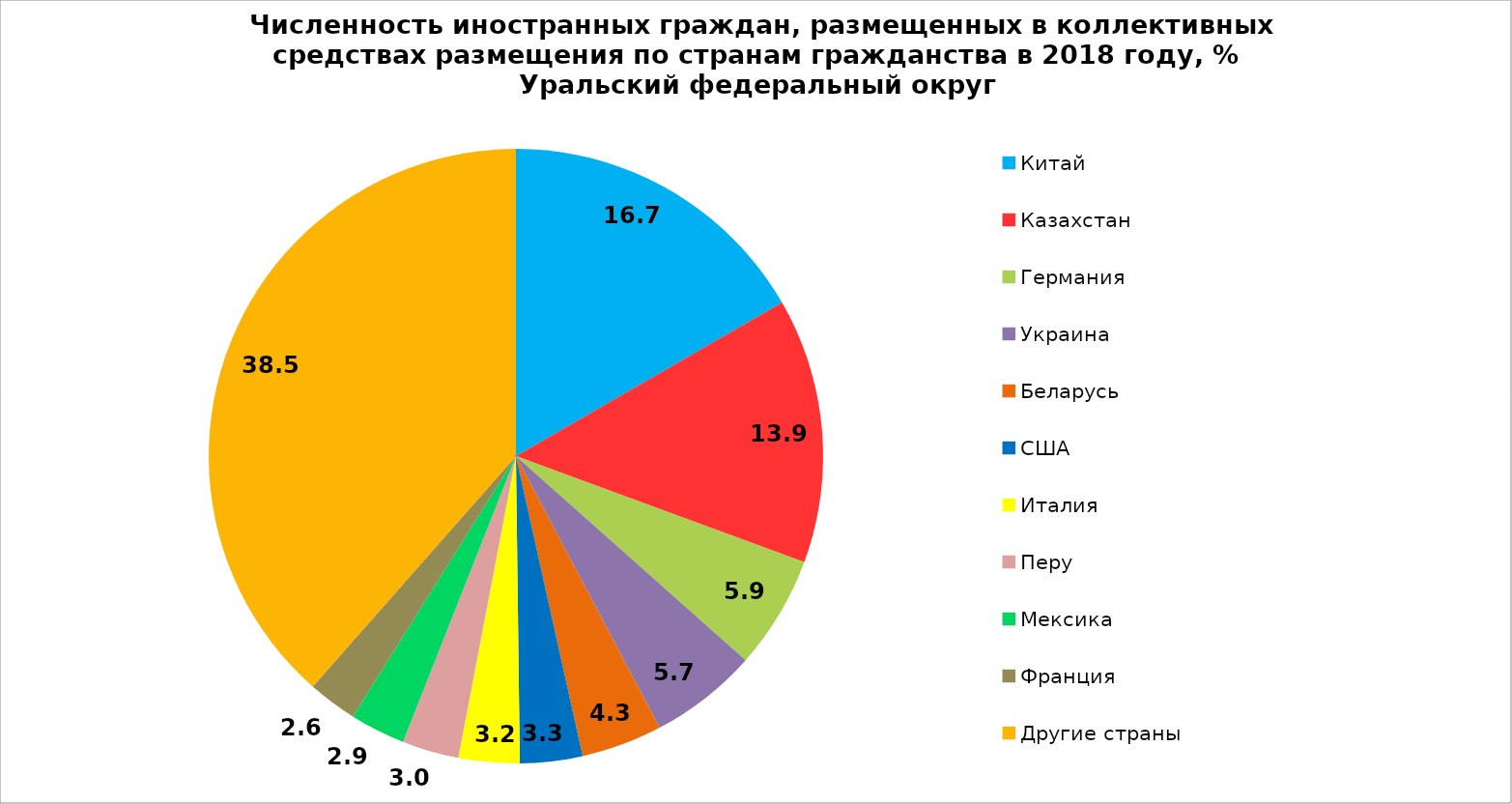
| Category | Series 0 |
|---|---|
| Китай | 16.671 |
| Казахстан | 13.943 |
| Германия | 5.945 |
| Украина | 5.694 |
| Беларусь | 4.261 |
| США | 3.285 |
| Италия | 3.206 |
| Перу | 2.986 |
| Мексика | 2.918 |
| Франция | 2.591 |
| Другие страны | 38.501 |